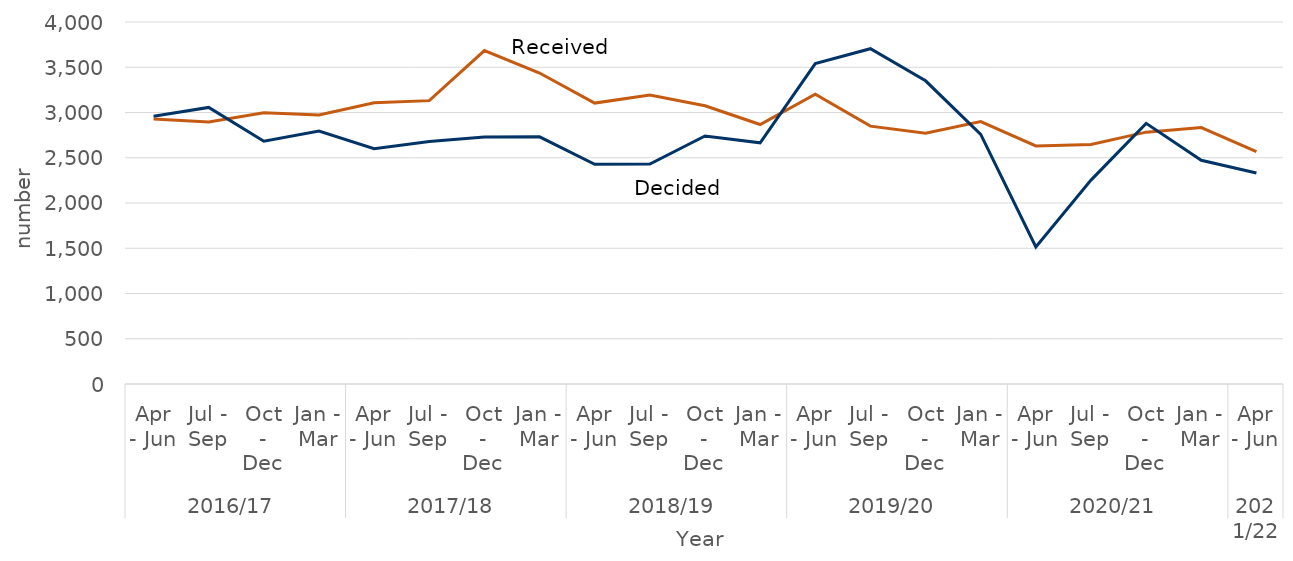
| Category | received | decided |
|---|---|---|
| 0 | 2929 | 2958 |
| 1 | 2895 | 3056 |
| 2 | 2997 | 2683 |
| 3 | 2972 | 2796 |
| 4 | 3108 | 2600 |
| 5 | 3131 | 2680 |
| 6 | 3684 | 2728 |
| 7 | 3436 | 2731 |
| 8 | 3104 | 2428 |
| 9 | 3192 | 2431 |
| 10 | 3074 | 2740 |
| 11 | 2867 | 2665 |
| 12 | 3203 | 3540 |
| 13 | 2849 | 3705 |
| 14 | 2772 | 3350 |
| 15 | 2900 | 2759 |
| 16 | 2631 | 1514 |
| 17 | 2647 | 2253 |
| 18 | 2783 | 2880 |
| 19 | 2833 | 2472 |
| 20 | 2568 | 2332 |